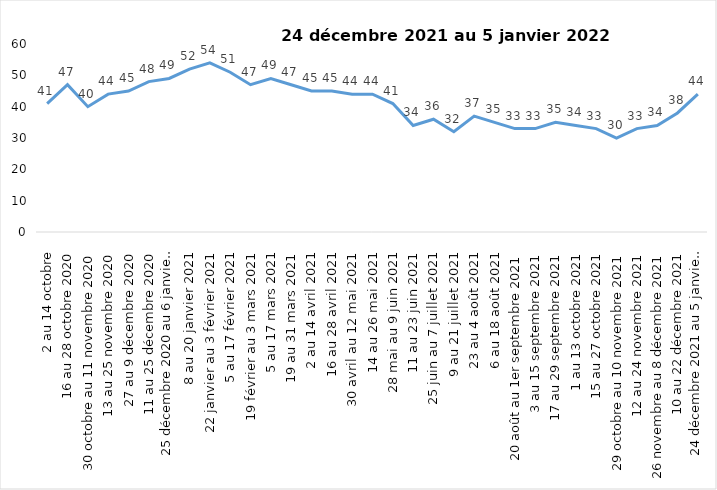
| Category | Toujours aux trois mesures |
|---|---|
| 2 au 14 octobre | 41 |
| 16 au 28 octobre 2020 | 47 |
| 30 octobre au 11 novembre 2020 | 40 |
| 13 au 25 novembre 2020 | 44 |
| 27 au 9 décembre 2020 | 45 |
| 11 au 25 décembre 2020 | 48 |
| 25 décembre 2020 au 6 janvier 2021 | 49 |
| 8 au 20 janvier 2021 | 52 |
| 22 janvier au 3 février 2021 | 54 |
| 5 au 17 février 2021 | 51 |
| 19 février au 3 mars 2021 | 47 |
| 5 au 17 mars 2021 | 49 |
| 19 au 31 mars 2021 | 47 |
| 2 au 14 avril 2021 | 45 |
| 16 au 28 avril 2021 | 45 |
| 30 avril au 12 mai 2021 | 44 |
| 14 au 26 mai 2021 | 44 |
| 28 mai au 9 juin 2021 | 41 |
| 11 au 23 juin 2021 | 34 |
| 25 juin au 7 juillet 2021 | 36 |
| 9 au 21 juillet 2021 | 32 |
| 23 au 4 août 2021 | 37 |
| 6 au 18 août 2021 | 35 |
| 20 août au 1er septembre 2021 | 33 |
| 3 au 15 septembre 2021 | 33 |
| 17 au 29 septembre 2021 | 35 |
| 1 au 13 octobre 2021 | 34 |
| 15 au 27 octobre 2021 | 33 |
| 29 octobre au 10 novembre 2021 | 30 |
| 12 au 24 novembre 2021 | 33 |
| 26 novembre au 8 décembre 2021 | 34 |
| 10 au 22 décembre 2021 | 38 |
| 24 décembre 2021 au 5 janvier 2022 2022 | 44 |